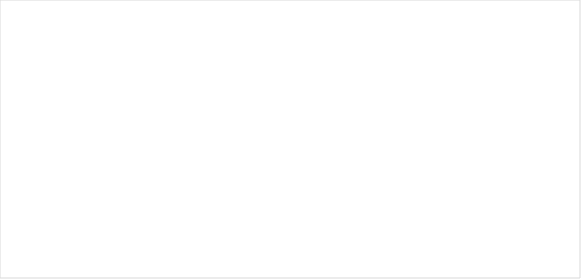
| Category | Teplota(°C)  | Vlhkost(%)  | Srážky(mm/h)  |
|---|---|---|---|
| 0 | -6 | 89 | 16 |
| 1 | -3 | 95 | 14 |
| 2 | -1 | 31 | 8 |
| 3 | -6 | 50 | 10 |
| 4 | 5 | 56 | 16 |
| 5 | -3 | 61 | 14 |
| 6 | 4 | 89 | 14 |
| 7 | -1 | 63 | 5 |
| 8 | 4 | 25 | 18 |
| 9 | -3 | 58 | 8 |
| 10 | -4 | 90 | 8 |
| 11 | 2 | 78 | 15 |
| 12 | 2 | 46 | 17 |
| 13 | -3 | 84 | 18 |
| 14 | -5 | 51 | 9 |
| 15 | 4 | 54 | 18 |
| 16 | 1 | 79 | 11 |
| 17 | 2 | 69 | 15 |
| 18 | 4 | 66 | 5 |
| 19 | 4 | 59 | 7 |
| 20 | 4 | 57 | 10 |
| 21 | -5 | 46 | 16 |
| 22 | 5 | 53 | 16 |
| 23 | 0 | 45 | 8 |
| 24 | -2 | 37 | 8 |
| 25 | -1 | 94 | 7 |
| 26 | -1 | 62 | 17 |
| 27 | 2 | 21 | 9 |
| 28 | -1 | 83 | 13 |
| 29 | 10 | 35 | 13 |
| 30 | 14 | 22 | 6 |
| 31 | 10 | 47 | 6 |
| 32 | 13 | 68 | 12 |
| 33 | 11 | 49 | 9 |
| 34 | 6 | 51 | 9 |
| 35 | 4 | 40 | 15 |
| 36 | 6 | 77 | 5 |
| 37 | 0 | 82 | 16 |
| 38 | 0 | 72 | 18 |
| 39 | 3 | 91 | 17 |
| 40 | 0 | 78 | 9 |
| 41 | 6 | 73 | 8 |
| 42 | 8 | 58 | 8 |
| 43 | 12 | 40 | 15 |
| 44 | 2 | 58 | 11 |
| 45 | 13 | 37 | 8 |
| 46 | 1 | 75 | 18 |
| 47 | 10 | 71 | 12 |
| 48 | -1 | 91 | 13 |
| 49 | 2 | 50 | 10 |
| 50 | 1 | 42 | 16 |
| 51 | -1 | 48 | 17 |
| 52 | 15 | 77 | 18 |
| 53 | 2 | 70 | 18 |
| 54 | 10 | 30 | 8 |
| 55 | 14 | 60 | 13 |
| 56 | 7 | 94 | 18 |
| 57 | 13 | 25 | 17 |
| 58 | 15 | 67 | 12 |
| 59 | 9 | 34 | 12 |
| 60 | 10 | 68 | 9 |
| 61 | 1 | 92 | 14 |
| 62 | 13 | 34 | 8 |
| 63 | 14 | 41 | 14 |
| 64 | 13 | 44 | 7 |
| 65 | 10 | 47 | 12 |
| 66 | 3 | 55 | 11 |
| 67 | 9 | 69 | 15 |
| 68 | 6 | 47 | 10 |
| 69 | 5 | 32 | 5 |
| 70 | 9 | 77 | 6 |
| 71 | 11 | 85 | 8 |
| 72 | 5 | 76 | 14 |
| 73 | 11 | 84 | 13 |
| 74 | 6 | 82 | 16 |
| 75 | 4 | 92 | 6 |
| 76 | 11 | 62 | 7 |
| 77 | 6 | 91 | 11 |
| 78 | 3 | 26 | 6 |
| 79 | 11 | 89 | 10 |
| 80 | 12 | 76 | 9 |
| 81 | 14 | 73 | 18 |
| 82 | 14 | 41 | 12 |
| 83 | 11 | 71 | 16 |
| 84 | 15 | 21 | 11 |
| 85 | 8 | 72 | 5 |
| 86 | 8 | 71 | 6 |
| 87 | 11 | 76 | 16 |
| 88 | 10 | 78 | 7 |
| 89 | 9 | 84 | 10 |
| 90 | 7 | 40 | 9 |
| 91 | 5 | 84 | 10 |
| 92 | 7 | 64 | 12 |
| 93 | 16 | 41 | 17 |
| 94 | 17 | 58 | 6 |
| 95 | 9 | 35 | 14 |
| 96 | 10 | 46 | 17 |
| 97 | 17 | 73 | 5 |
| 98 | 9 | 30 | 18 |
| 99 | 8 | 81 | 12 |
| 100 | 14 | 82 | 14 |
| 101 | 19 | 94 | 12 |
| 102 | 18 | 38 | 9 |
| 103 | 12 | 74 | 9 |
| 104 | 17 | 80 | 11 |
| 105 | 19 | 37 | 10 |
| 106 | 20 | 55 | 11 |
| 107 | 17 | 56 | 11 |
| 108 | 15 | 95 | 10 |
| 109 | 10 | 95 | 10 |
| 110 | 9 | 24 | 11 |
| 111 | 20 | 49 | 7 |
| 112 | 14 | 85 | 17 |
| 113 | 17 | 71 | 16 |
| 114 | 14 | 76 | 5 |
| 115 | 20 | 50 | 5 |
| 116 | 18 | 44 | 5 |
| 117 | 15 | 47 | 11 |
| 118 | 20 | 92 | 13 |
| 119 | 11 | 63 | 15 |
| 120 | 13 | 68 | 11 |
| 121 | 20 | 32 | 8 |
| 122 | 8 | 75 | 7 |
| 123 | 15 | 86 | 16 |
| 124 | 16 | 28 | 18 |
| 125 | 19 | 28 | 10 |
| 126 | 10 | 32 | 10 |
| 127 | 19 | 51 | 7 |
| 128 | 16 | 52 | 17 |
| 129 | 14 | 50 | 10 |
| 130 | 15 | 92 | 8 |
| 131 | 15 | 51 | 6 |
| 132 | 11 | 86 | 14 |
| 133 | 20 | 27 | 7 |
| 134 | 18 | 69 | 10 |
| 135 | 24 | 45 | 15 |
| 136 | 11 | 40 | 7 |
| 137 | 25 | 21 | 18 |
| 138 | 18 | 22 | 13 |
| 139 | 11 | 23 | 17 |
| 140 | 15 | 20 | 11 |
| 141 | 14 | 95 | 16 |
| 142 | 12 | 46 | 14 |
| 143 | 11 | 22 | 7 |
| 144 | 21 | 74 | 7 |
| 145 | 15 | 80 | 17 |
| 146 | 20 | 81 | 7 |
| 147 | 23 | 48 | 9 |
| 148 | 14 | 61 | 17 |
| 149 | 21 | 64 | 16 |
| 150 | 17 | 83 | 17 |
| 151 | 19 | 50 | 15 |
| 152 | 21 | 37 | 14 |
| 153 | 21 | 90 | 7 |
| 154 | 21 | 30 | 16 |
| 155 | 22 | 93 | 6 |
| 156 | 17 | 67 | 11 |
| 157 | 24 | 90 | 10 |
| 158 | 17 | 87 | 10 |
| 159 | 15 | 71 | 5 |
| 160 | 12 | 68 | 9 |
| 161 | 21 | 59 | 8 |
| 162 | 27 | 91 | 16 |
| 163 | 25 | 28 | 16 |
| 164 | 19 | 51 | 16 |
| 165 | 21 | 80 | 11 |
| 166 | 16 | 23 | 12 |
| 167 | 21 | 83 | 16 |
| 168 | 20 | 21 | 18 |
| 169 | 23 | 38 | 17 |
| 170 | 30 | 85 | 11 |
| 171 | 20 | 82 | 9 |
| 172 | 30 | 38 | 8 |
| 173 | 26 | 93 | 7 |
| 174 | 32 | 62 | 5 |
| 175 | 27 | 83 | 15 |
| 176 | 29 | 25 | 16 |
| 177 | 29 | 55 | 13 |
| 178 | 30 | 33 | 5 |
| 179 | 17 | 84 | 9 |
| 180 | 19 | 26 | 16 |
| 181 | 23 | 21 | 9 |
| 182 | 29 | 31 | 16 |
| 183 | 30 | 35 | 9 |
| 184 | 23 | 65 | 16 |
| 185 | 30 | 87 | 13 |
| 186 | 22 | 83 | 9 |
| 187 | 28 | 66 | 16 |
| 188 | 15 | 62 | 7 |
| 189 | 20 | 57 | 7 |
| 190 | 18 | 23 | 14 |
| 191 | 23 | 64 | 15 |
| 192 | 22 | 88 | 6 |
| 193 | 32 | 66 | 13 |
| 194 | 18 | 28 | 10 |
| 195 | 31 | 47 | 18 |
| 196 | 18 | 50 | 7 |
| 197 | 31 | 85 | 9 |
| 198 | 19 | 65 | 9 |
| 199 | 16 | 70 | 15 |
| 200 | 31 | 83 | 14 |
| 201 | 28 | 40 | 16 |
| 202 | 23 | 81 | 12 |
| 203 | 19 | 60 | 10 |
| 204 | 25 | 38 | 16 |
| 205 | 21 | 95 | 12 |
| 206 | 15 | 65 | 10 |
| 207 | 30 | 42 | 16 |
| 208 | 28 | 88 | 9 |
| 209 | 21 | 27 | 14 |
| 210 | 27 | 82 | 16 |
| 211 | 15 | 59 | 9 |